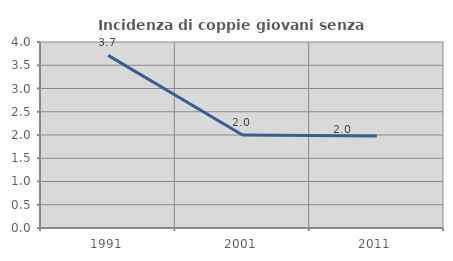
| Category | Incidenza di coppie giovani senza figli |
|---|---|
| 1991.0 | 3.712 |
| 2001.0 | 2 |
| 2011.0 | 1.977 |